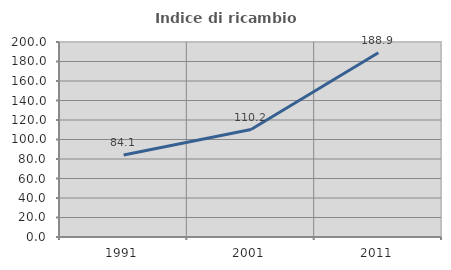
| Category | Indice di ricambio occupazionale  |
|---|---|
| 1991.0 | 84.127 |
| 2001.0 | 110.169 |
| 2011.0 | 188.889 |